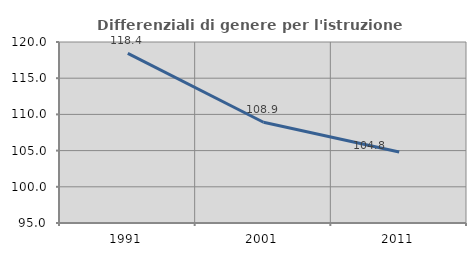
| Category | Differenziali di genere per l'istruzione superiore |
|---|---|
| 1991.0 | 118.434 |
| 2001.0 | 108.914 |
| 2011.0 | 104.799 |